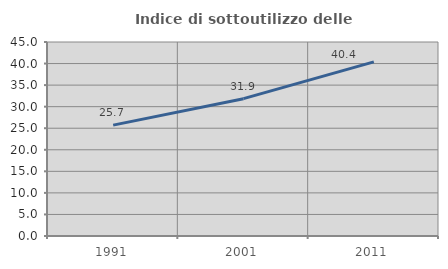
| Category | Indice di sottoutilizzo delle abitazioni  |
|---|---|
| 1991.0 | 25.719 |
| 2001.0 | 31.857 |
| 2011.0 | 40.38 |